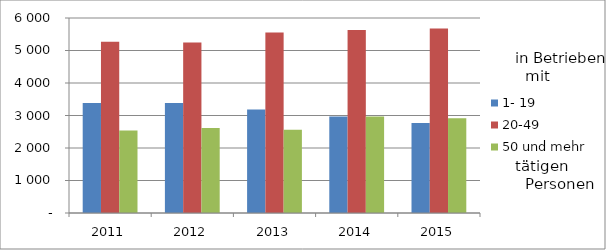
| Category | 1- 19 | 20-49 | 50 und mehr |
|---|---|---|---|
| 2011.0 | 3386 | 5267 | 2536 |
| 2012.0 | 3388 | 5244 | 2616 |
| 2013.0 | 3184 | 5551 | 2562 |
| 2014.0 | 2973 | 5631 | 2973 |
| 2015.0 | 2771 | 5678 | 2913 |